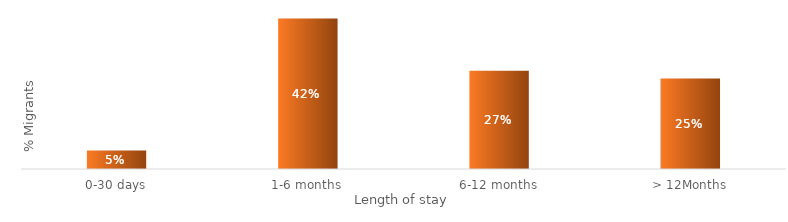
| Category | Series 0 |
|---|---|
| 0-30 days | 0.052 |
| 1-6 months | 0.42 |
| 6-12 months | 0.275 |
| > 12Months | 0.253 |